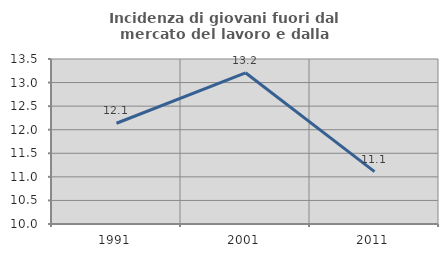
| Category | Incidenza di giovani fuori dal mercato del lavoro e dalla formazione  |
|---|---|
| 1991.0 | 12.137 |
| 2001.0 | 13.208 |
| 2011.0 | 11.111 |